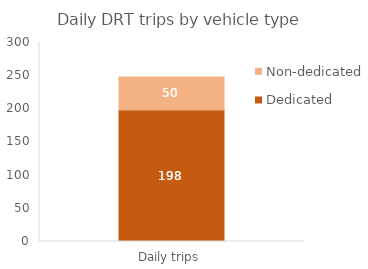
| Category | Dedicated | Non-dedicated |
|---|---|---|
| 0 | 198.36 | 49.59 |